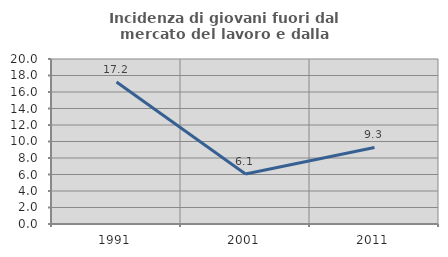
| Category | Incidenza di giovani fuori dal mercato del lavoro e dalla formazione  |
|---|---|
| 1991.0 | 17.221 |
| 2001.0 | 6.061 |
| 2011.0 | 9.278 |